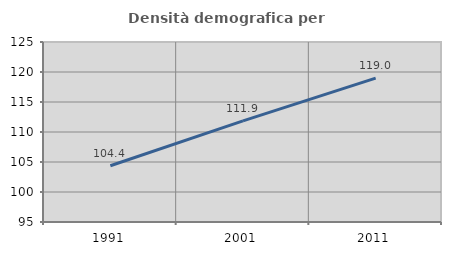
| Category | Densità demografica |
|---|---|
| 1991.0 | 104.377 |
| 2001.0 | 111.865 |
| 2011.0 | 118.988 |